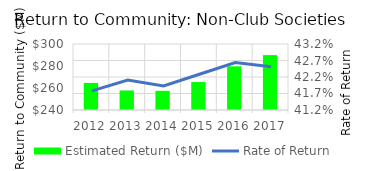
| Category | Estimated Return ($M) |
|---|---|
| 2012 | 264.623 |
| 2013 | 257.76 |
| 2014 | 257.443 |
| 2015 | 265.406 |
| 2016 | 279.716 |
| 2017 | 289.903 |